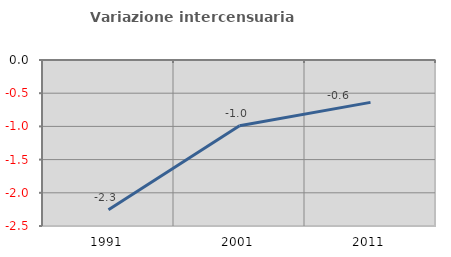
| Category | Variazione intercensuaria annua |
|---|---|
| 1991.0 | -2.255 |
| 2001.0 | -0.99 |
| 2011.0 | -0.638 |